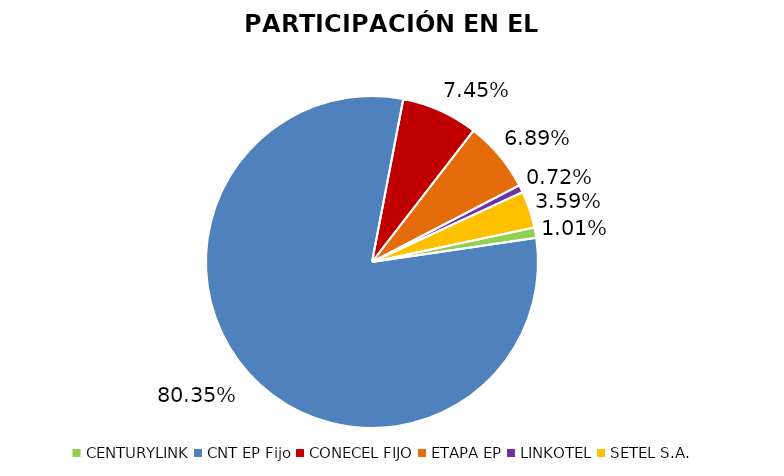
| Category | Participación en el Mercado |
|---|---|
| CENTURYLINK | 0.01 |
| CNT EP Fijo | 0.803 |
| CONECEL FIJO | 0.074 |
| ETAPA EP | 0.069 |
| LINKOTEL | 0.007 |
| SETEL S.A. | 0.036 |